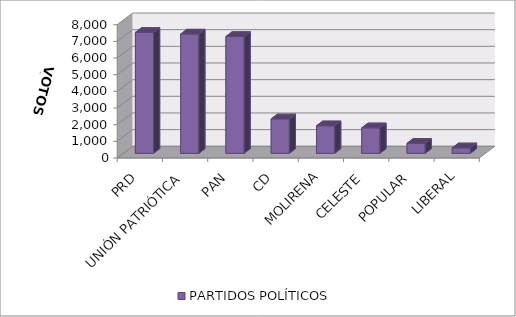
| Category | PARTIDOS POLÍTICOS |
|---|---|
| PRD | 7261 |
| UNIÓN PATRIÓTICA | 7162 |
| PAN | 7014 |
| CD | 2068 |
| MOLIRENA | 1653 |
| CELESTE | 1531 |
| POPULAR | 602 |
| LIBERAL | 329 |